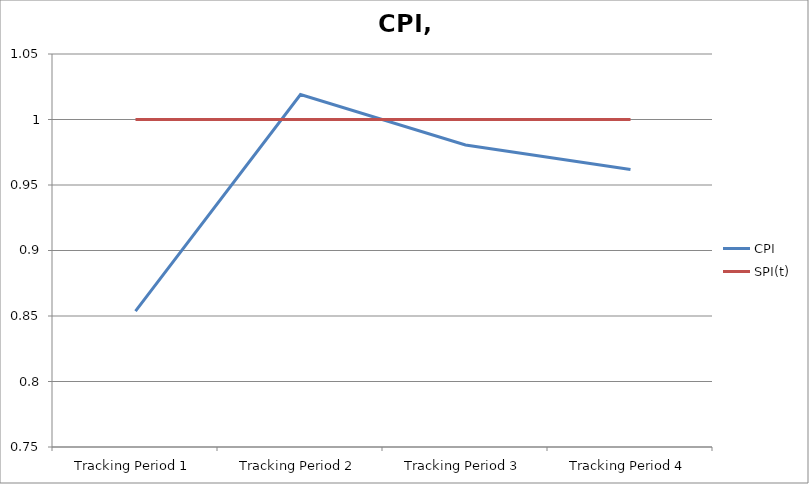
| Category | CPI | SPI(t) |
|---|---|---|
| Tracking Period 1 | 0.854 | 1 |
| Tracking Period 2 | 1.019 | 1 |
| Tracking Period 3 | 0.981 | 1 |
| Tracking Period 4 | 0.962 | 1 |